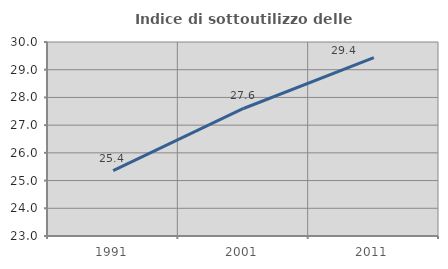
| Category | Indice di sottoutilizzo delle abitazioni  |
|---|---|
| 1991.0 | 25.358 |
| 2001.0 | 27.601 |
| 2011.0 | 29.436 |